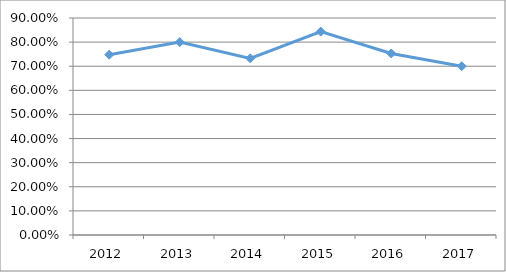
| Category | ELRM-D4O37 |
|---|---|
| 2012.0 | 0.748 |
| 2013.0 | 0.8 |
| 2014.0 | 0.733 |
| 2015.0 | 0.844 |
| 2016.0 | 0.753 |
| 2017.0 | 0.7 |